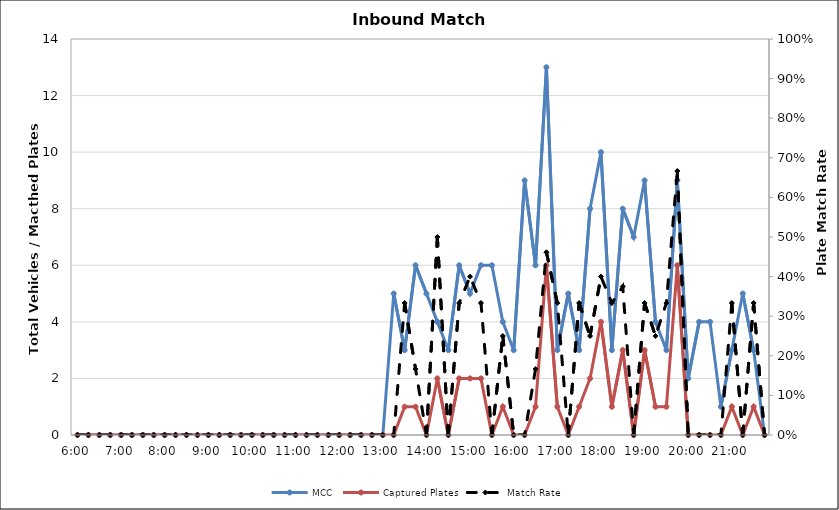
| Category | MCC | Captured Plates |
|---|---|---|
| 0.25 | 0 | 0 |
| 0.260416666666667 | 0 | 0 |
| 0.270833333333333 | 0 | 0 |
| 0.28125 | 0 | 0 |
| 0.291666666666667 | 0 | 0 |
| 0.302083333333333 | 0 | 0 |
| 0.3125 | 0 | 0 |
| 0.322916666666667 | 0 | 0 |
| 0.333333333333333 | 0 | 0 |
| 0.34375 | 0 | 0 |
| 0.354166666666667 | 0 | 0 |
| 0.364583333333333 | 0 | 0 |
| 0.375 | 0 | 0 |
| 0.385416666666667 | 0 | 0 |
| 0.395833333333333 | 0 | 0 |
| 0.40625 | 0 | 0 |
| 0.416666666666667 | 0 | 0 |
| 0.427083333333333 | 0 | 0 |
| 0.4375 | 0 | 0 |
| 0.447916666666667 | 0 | 0 |
| 0.458333333333333 | 0 | 0 |
| 0.46875 | 0 | 0 |
| 0.479166666666667 | 0 | 0 |
| 0.489583333333333 | 0 | 0 |
| 0.5 | 0 | 0 |
| 0.510416666666667 | 0 | 0 |
| 0.520833333333333 | 0 | 0 |
| 0.53125 | 0 | 0 |
| 0.541666666666667 | 0 | 0 |
| 0.552083333333333 | 5 | 0 |
| 0.5625 | 3 | 1 |
| 0.572916666666667 | 6 | 1 |
| 0.583333333333333 | 5 | 0 |
| 0.59375 | 4 | 2 |
| 0.604166666666667 | 3 | 0 |
| 0.614583333333333 | 6 | 2 |
| 0.625 | 5 | 2 |
| 0.635416666666667 | 6 | 2 |
| 0.645833333333333 | 6 | 0 |
| 0.65625 | 4 | 1 |
| 0.666666666666667 | 3 | 0 |
| 0.677083333333333 | 9 | 0 |
| 0.6875 | 6 | 1 |
| 0.697916666666667 | 13 | 6 |
| 0.708333333333333 | 3 | 1 |
| 0.71875 | 5 | 0 |
| 0.729166666666667 | 3 | 1 |
| 0.739583333333333 | 8 | 2 |
| 0.75 | 10 | 4 |
| 0.760416666666667 | 3 | 1 |
| 0.770833333333333 | 8 | 3 |
| 0.78125 | 7 | 0 |
| 0.791666666666667 | 9 | 3 |
| 0.802083333333333 | 4 | 1 |
| 0.8125 | 3 | 1 |
| 0.822916666666667 | 9 | 6 |
| 0.833333333333333 | 2 | 0 |
| 0.84375 | 4 | 0 |
| 0.854166666666667 | 4 | 0 |
| 0.864583333333333 | 1 | 0 |
| 0.875 | 3 | 1 |
| 0.885416666666667 | 5 | 0 |
| 0.895833333333333 | 3 | 1 |
| 0.90625 | 0 | 0 |